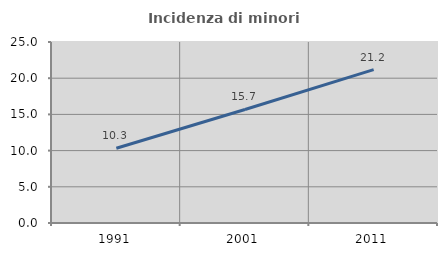
| Category | Incidenza di minori stranieri |
|---|---|
| 1991.0 | 10.327 |
| 2001.0 | 15.683 |
| 2011.0 | 21.176 |